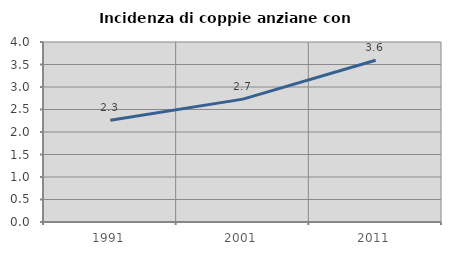
| Category | Incidenza di coppie anziane con figli |
|---|---|
| 1991.0 | 2.261 |
| 2001.0 | 2.73 |
| 2011.0 | 3.595 |